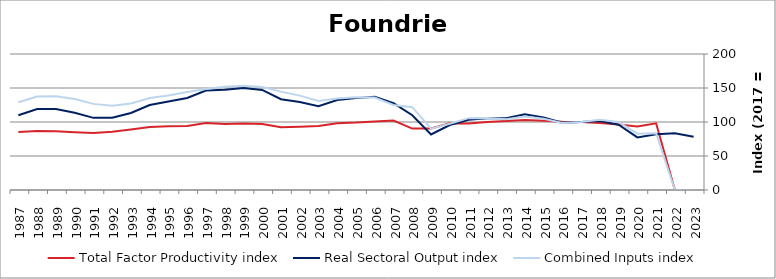
| Category | Total Factor Productivity index | Real Sectoral Output index | Combined Inputs index |
|---|---|---|---|
| 2023.0 | 0 | 78.36 | 0 |
| 2022.0 | 0 | 83.52 | 0 |
| 2021.0 | 98.1 | 81.924 | 83.511 |
| 2020.0 | 93.336 | 77.31 | 82.829 |
| 2019.0 | 96.176 | 96.095 | 99.915 |
| 2018.0 | 98.447 | 101.599 | 103.201 |
| 2017.0 | 100 | 100 | 100 |
| 2016.0 | 100.37 | 98.801 | 98.437 |
| 2015.0 | 101.867 | 106.714 | 104.759 |
| 2014.0 | 103.055 | 111.478 | 108.174 |
| 2013.0 | 101.35 | 105.438 | 104.034 |
| 2012.0 | 99.881 | 105.666 | 105.792 |
| 2011.0 | 97.877 | 103.407 | 105.65 |
| 2010.0 | 98.071 | 95.573 | 97.453 |
| 2009.0 | 90.568 | 81.611 | 90.11 |
| 2008.0 | 90.328 | 110.022 | 121.802 |
| 2007.0 | 102.036 | 127.649 | 125.103 |
| 2006.0 | 100.747 | 137.09 | 136.073 |
| 2005.0 | 99.146 | 135.109 | 136.273 |
| 2004.0 | 98.296 | 132.299 | 134.592 |
| 2003.0 | 94.244 | 123.328 | 130.86 |
| 2002.0 | 93.179 | 129.298 | 138.763 |
| 2001.0 | 92.261 | 133.498 | 144.696 |
| 2000.0 | 97.094 | 147.154 | 151.558 |
| 1999.0 | 97.723 | 149.84 | 153.332 |
| 1998.0 | 97.217 | 147.561 | 151.785 |
| 1997.0 | 98.48 | 146.302 | 148.56 |
| 1996.0 | 93.981 | 135.42 | 144.093 |
| 1995.0 | 93.774 | 130.296 | 138.946 |
| 1994.0 | 92.472 | 125.06 | 135.242 |
| 1993.0 | 88.888 | 113.197 | 127.348 |
| 1992.0 | 85.699 | 106.227 | 123.953 |
| 1991.0 | 83.777 | 106.101 | 126.647 |
| 1990.0 | 84.912 | 113.565 | 133.745 |
| 1989.0 | 86.519 | 119.128 | 137.689 |
| 1988.0 | 86.677 | 119.124 | 137.434 |
| 1987.0 | 85.116 | 109.823 | 129.027 |